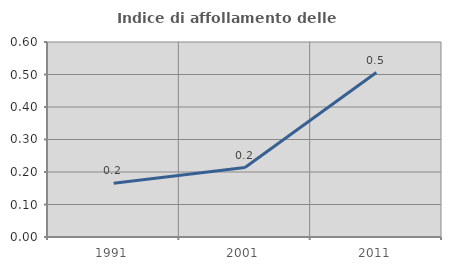
| Category | Indice di affollamento delle abitazioni  |
|---|---|
| 1991.0 | 0.165 |
| 2001.0 | 0.214 |
| 2011.0 | 0.506 |